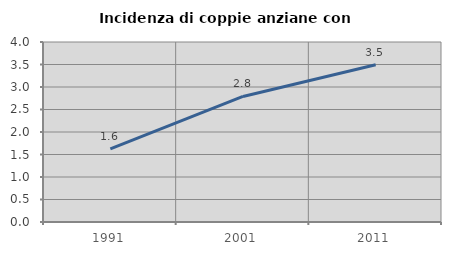
| Category | Incidenza di coppie anziane con figli |
|---|---|
| 1991.0 | 1.625 |
| 2001.0 | 2.791 |
| 2011.0 | 3.495 |